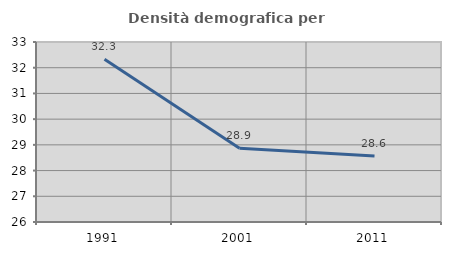
| Category | Densità demografica |
|---|---|
| 1991.0 | 32.33 |
| 2001.0 | 28.869 |
| 2011.0 | 28.566 |